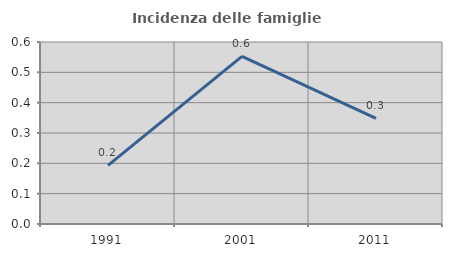
| Category | Incidenza delle famiglie numerose |
|---|---|
| 1991.0 | 0.193 |
| 2001.0 | 0.552 |
| 2011.0 | 0.348 |